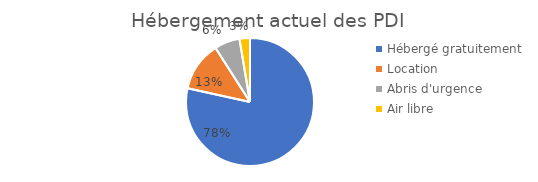
| Category | Type d'abris |
|---|---|
| Hébergé gratuitement  | 0.784 |
| Location | 0.125 |
| Abris d'urgence | 0.064 |
| Air libre | 0.026 |